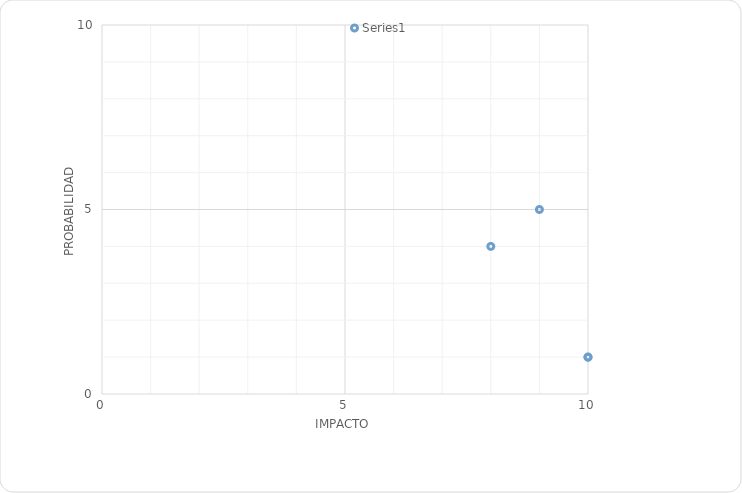
| Category | Series 0 |
|---|---|
| 9.0 | 5 |
| 10.0 | 1 |
| 10.0 | 1 |
| 8.0 | 4 |